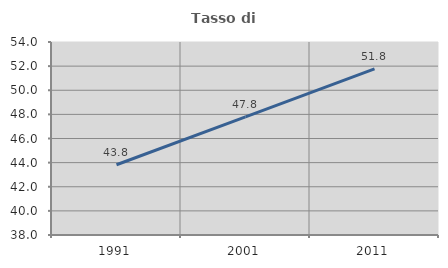
| Category | Tasso di occupazione   |
|---|---|
| 1991.0 | 43.826 |
| 2001.0 | 47.792 |
| 2011.0 | 51.776 |